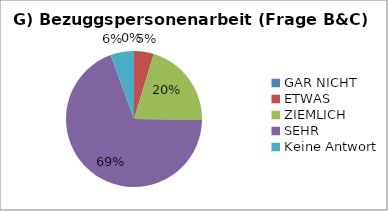
| Category | Series 0 |
|---|---|
| GAR NICHT | 0 |
| ETWAS | 11 |
| ZIEMLICH | 48 |
| SEHR | 162 |
| Keine Antwort | 13 |